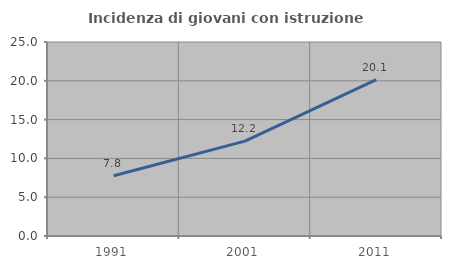
| Category | Incidenza di giovani con istruzione universitaria |
|---|---|
| 1991.0 | 7.77 |
| 2001.0 | 12.225 |
| 2011.0 | 20.147 |